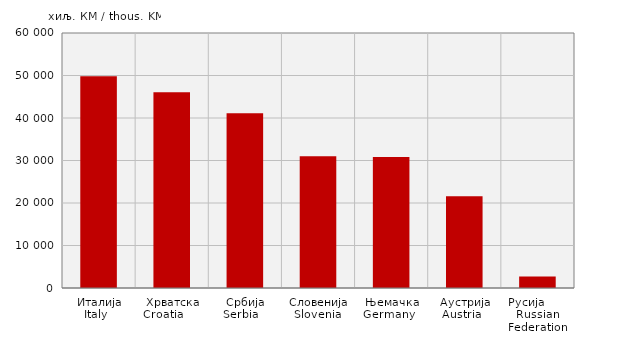
| Category | Извоз
Export |
|---|---|
| Италија
Italy   | 49800 |
| Хрватска
Croatia       | 46085 |
| Србија
Serbia    | 41104 |
| Словенија
Slovenia  | 30972 |
| Њемачка
Germany   | 30827 |
| Аустрија
Austria   | 21575 |
| Русија        Russian Federation | 2725 |